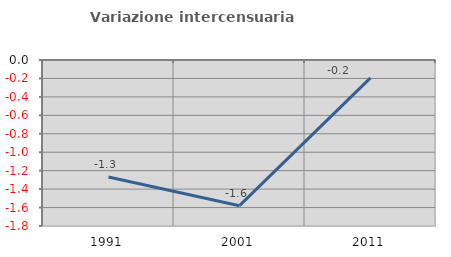
| Category | Variazione intercensuaria annua |
|---|---|
| 1991.0 | -1.268 |
| 2001.0 | -1.58 |
| 2011.0 | -0.194 |